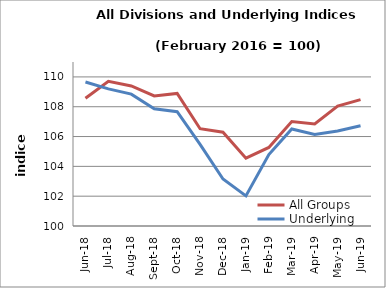
| Category | All Groups | Underlying |
|---|---|---|
| 2018-06-01 | 108.567 | 109.659 |
| 2018-07-01 | 109.702 | 109.198 |
| 2018-08-01 | 109.392 | 108.845 |
| 2018-09-01 | 108.722 | 107.857 |
| 2018-10-01 | 108.895 | 107.664 |
| 2018-11-01 | 106.524 | 105.471 |
| 2018-12-01 | 106.292 | 103.148 |
| 2019-01-01 | 104.55 | 102.019 |
| 2019-02-01 | 105.272 | 104.794 |
| 2019-03-01 | 107.012 | 106.51 |
| 2019-04-01 | 106.842 | 106.143 |
| 2019-05-01 | 108.044 | 106.37 |
| 2019-06-01 | 108.473 | 106.721 |